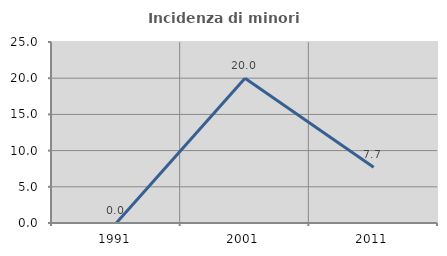
| Category | Incidenza di minori stranieri |
|---|---|
| 1991.0 | 0 |
| 2001.0 | 20 |
| 2011.0 | 7.692 |